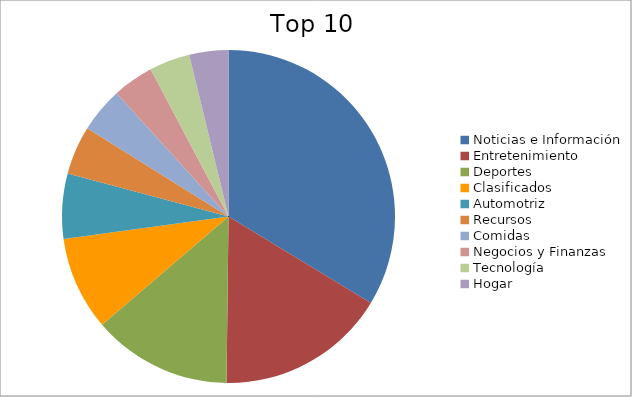
| Category | Series 0 |
|---|---|
| Noticias e Información | 29.32 |
| Entretenimiento | 14.37 |
| Deportes | 11.78 |
| Clasificados | 7.93 |
| Automotriz | 5.51 |
| Recursos | 4.11 |
| Comidas | 3.82 |
| Negocios y Finanzas | 3.47 |
| Tecnología | 3.44 |
| Hogar | 3.3 |